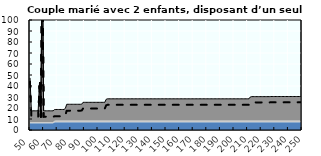
| Category | Coin fiscal marginal (somme des composantes) | Taux d’imposition marginal net |
|---|---|---|
| 50.0 | 47.38 | 43.97 |
| 51.0 | 17.436 | 12.085 |
| 52.0 | 17.436 | 12.085 |
| 53.0 | 17.436 | 12.085 |
| 54.0 | 17.436 | 12.085 |
| 55.0 | 17.436 | 12.085 |
| 56.0 | 17.436 | 12.085 |
| 57.0 | 43.62 | 39.966 |
| 58.0 | 17.436 | 12.085 |
| 59.0 | 176.016 | 180.943 |
| 60.0 | 17.436 | 12.085 |
| 61.0 | 17.436 | 12.085 |
| 62.0 | 17.436 | 12.085 |
| 63.0 | 17.436 | 12.085 |
| 64.0 | 17.436 | 12.085 |
| 65.0 | 17.436 | 12.085 |
| 66.0 | 17.436 | 12.085 |
| 67.0 | 17.436 | 12.085 |
| 68.0 | 18.54 | 12.448 |
| 69.0 | 18.652 | 12.485 |
| 70.0 | 18.652 | 12.485 |
| 71.0 | 18.652 | 12.485 |
| 72.0 | 18.652 | 12.485 |
| 73.0 | 18.652 | 12.485 |
| 74.0 | 18.652 | 12.485 |
| 75.0 | 18.652 | 12.485 |
| 76.0 | 19.654 | 13.563 |
| 77.0 | 23.392 | 17.584 |
| 78.0 | 23.392 | 17.584 |
| 79.0 | 23.392 | 17.584 |
| 80.0 | 23.392 | 17.584 |
| 81.0 | 23.392 | 17.584 |
| 82.0 | 23.392 | 17.584 |
| 83.0 | 23.392 | 17.584 |
| 84.0 | 23.392 | 17.584 |
| 85.0 | 23.392 | 17.584 |
| 86.0 | 23.392 | 17.584 |
| 87.0 | 23.392 | 17.584 |
| 88.0 | 23.465 | 17.663 |
| 89.0 | 25.169 | 19.496 |
| 90.0 | 25.169 | 19.496 |
| 91.0 | 25.169 | 19.496 |
| 92.0 | 25.169 | 19.496 |
| 93.0 | 25.169 | 19.496 |
| 94.0 | 25.169 | 19.496 |
| 95.0 | 25.169 | 19.496 |
| 96.0 | 25.169 | 19.496 |
| 97.0 | 25.169 | 19.496 |
| 98.0 | 25.169 | 19.496 |
| 99.0 | 25.169 | 19.496 |
| 100.0 | 25.169 | 19.496 |
| 101.0 | 25.169 | 19.496 |
| 102.0 | 25.169 | 19.496 |
| 103.0 | 25.169 | 19.496 |
| 104.0 | 25.169 | 19.496 |
| 105.0 | 25.169 | 19.496 |
| 106.0 | 27.913 | 22.448 |
| 107.0 | 28.354 | 22.922 |
| 108.0 | 28.354 | 22.922 |
| 109.0 | 28.354 | 22.922 |
| 110.0 | 28.354 | 22.922 |
| 111.0 | 28.354 | 22.922 |
| 112.0 | 28.354 | 22.922 |
| 113.0 | 28.354 | 22.922 |
| 114.0 | 28.354 | 22.922 |
| 115.0 | 28.354 | 22.922 |
| 116.0 | 28.354 | 22.922 |
| 117.0 | 28.354 | 22.922 |
| 118.0 | 28.354 | 22.922 |
| 119.0 | 28.354 | 22.922 |
| 120.0 | 28.354 | 22.922 |
| 121.0 | 28.354 | 22.922 |
| 122.0 | 28.354 | 22.922 |
| 123.0 | 28.354 | 22.922 |
| 124.0 | 28.354 | 22.922 |
| 125.0 | 28.354 | 22.922 |
| 126.0 | 28.354 | 22.922 |
| 127.0 | 28.354 | 22.922 |
| 128.0 | 28.354 | 22.922 |
| 129.0 | 28.354 | 22.922 |
| 130.0 | 28.354 | 22.922 |
| 131.0 | 28.354 | 22.922 |
| 132.0 | 28.354 | 22.922 |
| 133.0 | 28.354 | 22.922 |
| 134.0 | 28.354 | 22.922 |
| 135.0 | 28.354 | 22.922 |
| 136.0 | 28.354 | 22.922 |
| 137.0 | 28.354 | 22.922 |
| 138.0 | 28.354 | 22.922 |
| 139.0 | 28.354 | 22.922 |
| 140.0 | 28.354 | 22.922 |
| 141.0 | 28.354 | 22.922 |
| 142.0 | 28.354 | 22.922 |
| 143.0 | 28.354 | 22.922 |
| 144.0 | 28.354 | 22.922 |
| 145.0 | 28.354 | 22.922 |
| 146.0 | 28.354 | 22.922 |
| 147.0 | 28.354 | 22.922 |
| 148.0 | 28.354 | 22.922 |
| 149.0 | 28.354 | 22.922 |
| 150.0 | 28.354 | 22.922 |
| 151.0 | 28.354 | 22.922 |
| 152.0 | 28.354 | 22.922 |
| 153.0 | 28.354 | 22.922 |
| 154.0 | 28.354 | 22.922 |
| 155.0 | 28.354 | 22.922 |
| 156.0 | 28.354 | 22.922 |
| 157.0 | 28.354 | 22.922 |
| 158.0 | 28.354 | 22.922 |
| 159.0 | 28.354 | 22.922 |
| 160.0 | 28.354 | 22.922 |
| 161.0 | 28.354 | 22.922 |
| 162.0 | 28.354 | 22.922 |
| 163.0 | 28.354 | 22.922 |
| 164.0 | 28.354 | 22.922 |
| 165.0 | 28.354 | 22.922 |
| 166.0 | 28.354 | 22.922 |
| 167.0 | 28.354 | 22.922 |
| 168.0 | 28.354 | 22.922 |
| 169.0 | 28.354 | 22.922 |
| 170.0 | 28.354 | 22.922 |
| 171.0 | 28.354 | 22.922 |
| 172.0 | 28.354 | 22.922 |
| 173.0 | 28.354 | 22.922 |
| 174.0 | 28.354 | 22.922 |
| 175.0 | 28.354 | 22.922 |
| 176.0 | 28.354 | 22.922 |
| 177.0 | 28.354 | 22.922 |
| 178.0 | 28.354 | 22.922 |
| 179.0 | 28.354 | 22.922 |
| 180.0 | 28.354 | 22.922 |
| 181.0 | 28.354 | 22.922 |
| 182.0 | 28.354 | 22.922 |
| 183.0 | 28.354 | 22.922 |
| 184.0 | 28.354 | 22.922 |
| 185.0 | 28.354 | 22.922 |
| 186.0 | 28.354 | 22.922 |
| 187.0 | 28.354 | 22.922 |
| 188.0 | 28.354 | 22.922 |
| 189.0 | 28.354 | 22.922 |
| 190.0 | 28.354 | 22.922 |
| 191.0 | 28.354 | 22.922 |
| 192.0 | 28.354 | 22.922 |
| 193.0 | 28.354 | 22.922 |
| 194.0 | 28.354 | 22.922 |
| 195.0 | 28.354 | 22.922 |
| 196.0 | 28.354 | 22.922 |
| 197.0 | 28.354 | 22.922 |
| 198.0 | 28.354 | 22.922 |
| 199.0 | 28.354 | 22.922 |
| 200.0 | 28.354 | 22.922 |
| 201.0 | 28.354 | 22.922 |
| 202.0 | 28.354 | 22.922 |
| 203.0 | 28.354 | 22.922 |
| 204.0 | 28.354 | 22.922 |
| 205.0 | 28.354 | 22.922 |
| 206.0 | 28.354 | 22.922 |
| 207.0 | 28.354 | 22.922 |
| 208.0 | 28.354 | 22.922 |
| 209.0 | 28.354 | 22.922 |
| 210.0 | 28.354 | 22.922 |
| 211.0 | 28.354 | 22.922 |
| 212.0 | 30.034 | 24.73 |
| 213.0 | 30.353 | 25.073 |
| 214.0 | 30.353 | 25.073 |
| 215.0 | 30.353 | 25.073 |
| 216.0 | 30.353 | 25.073 |
| 217.0 | 30.353 | 25.073 |
| 218.0 | 30.353 | 25.073 |
| 219.0 | 30.353 | 25.073 |
| 220.0 | 30.353 | 25.073 |
| 221.0 | 30.353 | 25.073 |
| 222.0 | 30.353 | 25.073 |
| 223.0 | 30.353 | 25.073 |
| 224.0 | 30.353 | 25.073 |
| 225.0 | 30.353 | 25.073 |
| 226.0 | 30.353 | 25.073 |
| 227.0 | 30.434 | 25.16 |
| 228.0 | 30.443 | 25.17 |
| 229.0 | 30.443 | 25.17 |
| 230.0 | 30.443 | 25.17 |
| 231.0 | 30.443 | 25.17 |
| 232.0 | 30.443 | 25.17 |
| 233.0 | 30.443 | 25.17 |
| 234.0 | 30.443 | 25.17 |
| 235.0 | 30.443 | 25.17 |
| 236.0 | 30.443 | 25.17 |
| 237.0 | 30.443 | 25.17 |
| 238.0 | 30.443 | 25.17 |
| 239.0 | 30.443 | 25.17 |
| 240.0 | 30.443 | 25.17 |
| 241.0 | 30.443 | 25.17 |
| 242.0 | 30.443 | 25.17 |
| 243.0 | 30.443 | 25.17 |
| 244.0 | 30.443 | 25.17 |
| 245.0 | 30.443 | 25.17 |
| 246.0 | 30.443 | 25.17 |
| 247.0 | 30.443 | 25.17 |
| 248.0 | 30.443 | 25.17 |
| 249.0 | 30.443 | 25.17 |
| 250.0 | 30.443 | 25.17 |